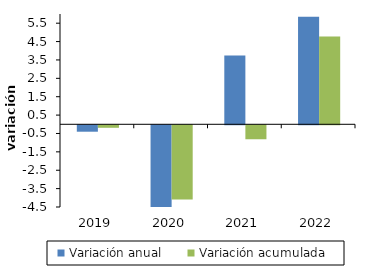
| Category | Variación anual | Variación acumulada |
|---|---|---|
| 2019-05-01 | -0.35 | -0.136 |
| 2020-05-01 | -8.509 | -4.034 |
| 2021-05-01 | 3.737 | -0.76 |
| 2022-05-01 | 5.856 | 4.776 |